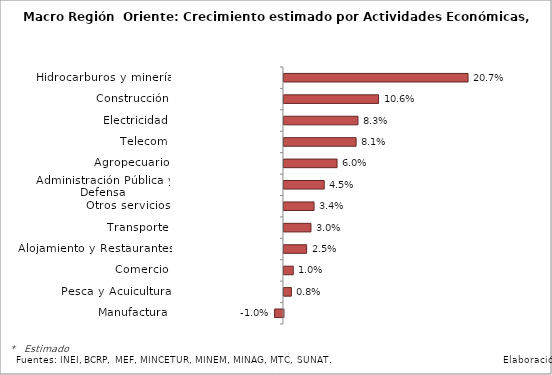
| Category | Series 0 |
|---|---|
| Hidrocarburos y minería | 0.207 |
| Construcción | 0.106 |
| Electricidad | 0.083 |
| Telecom | 0.081 |
| Agropecuario | 0.06 |
| Administración Pública y Defensa | 0.045 |
| Otros servicios | 0.034 |
| Transporte | 0.03 |
| Alojamiento y Restaurantes | 0.025 |
| Comercio | 0.01 |
| Pesca y Acuicultura | 0.008 |
| Manufactura | -0.01 |